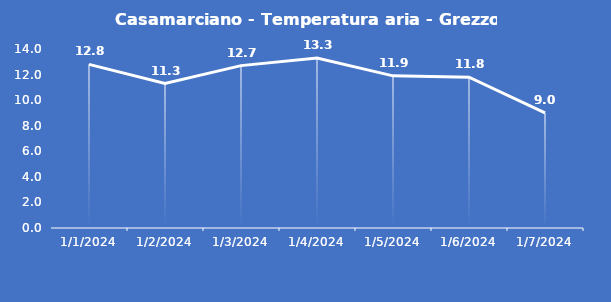
| Category | Casamarciano - Temperatura aria - Grezzo (°C) |
|---|---|
| 1/1/24 | 12.8 |
| 1/2/24 | 11.3 |
| 1/3/24 | 12.7 |
| 1/4/24 | 13.3 |
| 1/5/24 | 11.9 |
| 1/6/24 | 11.8 |
| 1/7/24 | 9 |